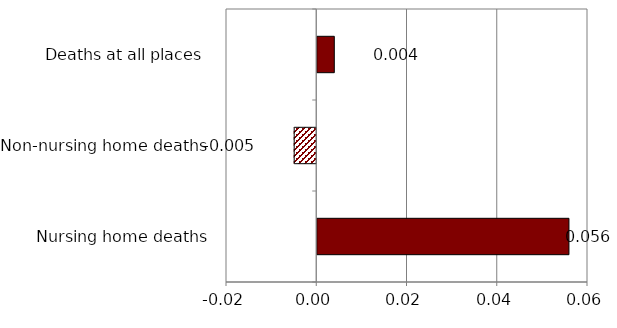
| Category | Series 0 |
|---|---|
| Nursing home deaths | 0.056 |
| Non-nursing home deaths | -0.005 |
| Deaths at all places  | 0.004 |